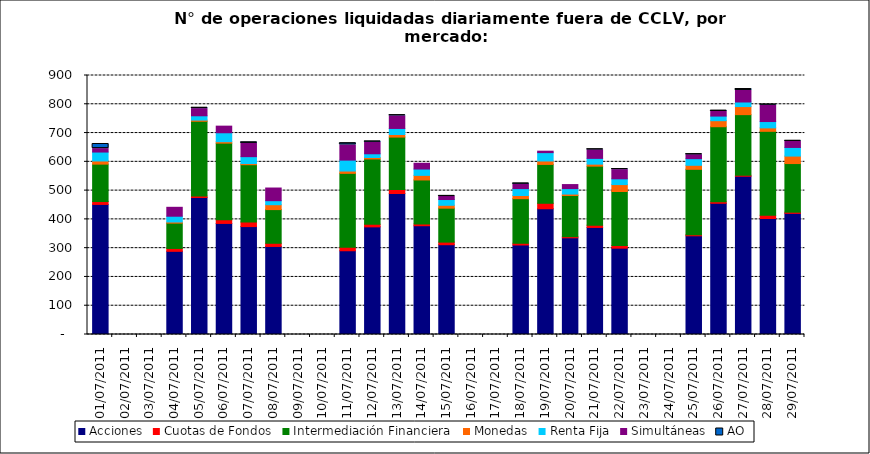
| Category | Acciones | Cuotas de Fondos | Intermediación Financiera | Monedas | Renta Fija | Simultáneas | AO |
|---|---|---|---|---|---|---|---|
| 01/07/2011 | 452 | 10 | 130 | 11 | 31 | 12 | 16 |
| 04/07/2011 | 289 | 10 | 88 | 4 | 20 | 31 | 0 |
| 05/07/2011 | 476 | 5 | 260 | 4 | 15 | 25 | 3 |
| 06/07/2011 | 386 | 13 | 266 | 5 | 31 | 23 | 0 |
| 07/07/2011 | 375 | 16 | 199 | 4 | 24 | 46 | 4 |
| 08/07/2011 | 306 | 11 | 117 | 17 | 14 | 44 | 0 |
| 11/07/2011 | 291 | 12 | 257 | 8 | 38 | 53 | 6 |
| 12/07/2011 | 374 | 9 | 227 | 5 | 13 | 40 | 3 |
| 13/07/2011 | 490 | 14 | 182 | 9 | 21 | 44 | 2 |
| 14/07/2011 | 378 | 6 | 153 | 16 | 22 | 20 | 0 |
| 15/07/2011 | 312 | 9 | 118 | 10 | 20 | 11 | 1 |
| 18/07/2011 | 311 | 6 | 155 | 11 | 24 | 15 | 3 |
| 19/07/2011 | 437 | 19 | 135 | 12 | 29 | 5 | 0 |
| 20/07/2011 | 336 | 4 | 143 | 5 | 19 | 14 | 0 |
| 21/07/2011 | 372 | 8 | 205 | 7 | 20 | 30 | 1 |
| 22/07/2011 | 300 | 9 | 188 | 24 | 20 | 32 | 2 |
| 25/07/2011 | 343 | 4 | 227 | 14 | 23 | 14 | 1 |
| 26/07/2011 | 456 | 5 | 261 | 21 | 16 | 16 | 3 |
| 27/07/2011 | 550 | 3 | 211 | 28 | 16 | 40 | 5 |
| 28/07/2011 | 403 | 11 | 292 | 12 | 22 | 57 | 2 |
| 29/07/2011 | 421 | 4 | 169 | 26 | 30 | 21 | 2 |